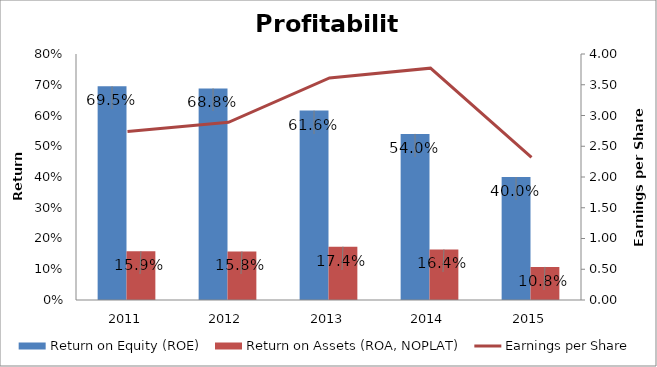
| Category | Return on Equity (ROE) | Return on Assets (ROA, NOPLAT) |
|---|---|---|
| 2011.0 | 0.695 | 0.159 |
| 2012.0 | 0.688 | 0.158 |
| 2013.0 | 0.616 | 0.174 |
| 2014.0 | 0.54 | 0.164 |
| 2015.0 | 0.4 | 0.108 |